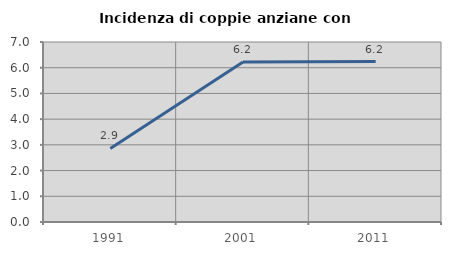
| Category | Incidenza di coppie anziane con figli |
|---|---|
| 1991.0 | 2.861 |
| 2001.0 | 6.222 |
| 2011.0 | 6.24 |